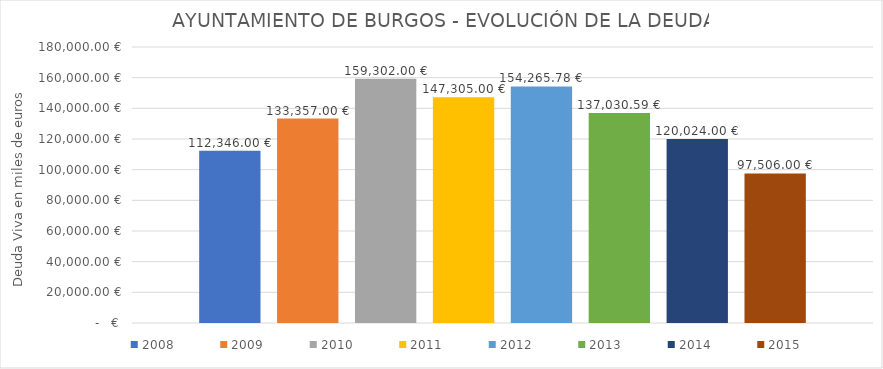
| Category | 2008 | 2009 | 2010 | 2011 | 2012 | 2013 | 2014 | 2015 |
|---|---|---|---|---|---|---|---|---|
| 0 | 112346 | 133357 | 159302 | 147305 | 154265.78 | 137030.59 | 120024 | 97506 |